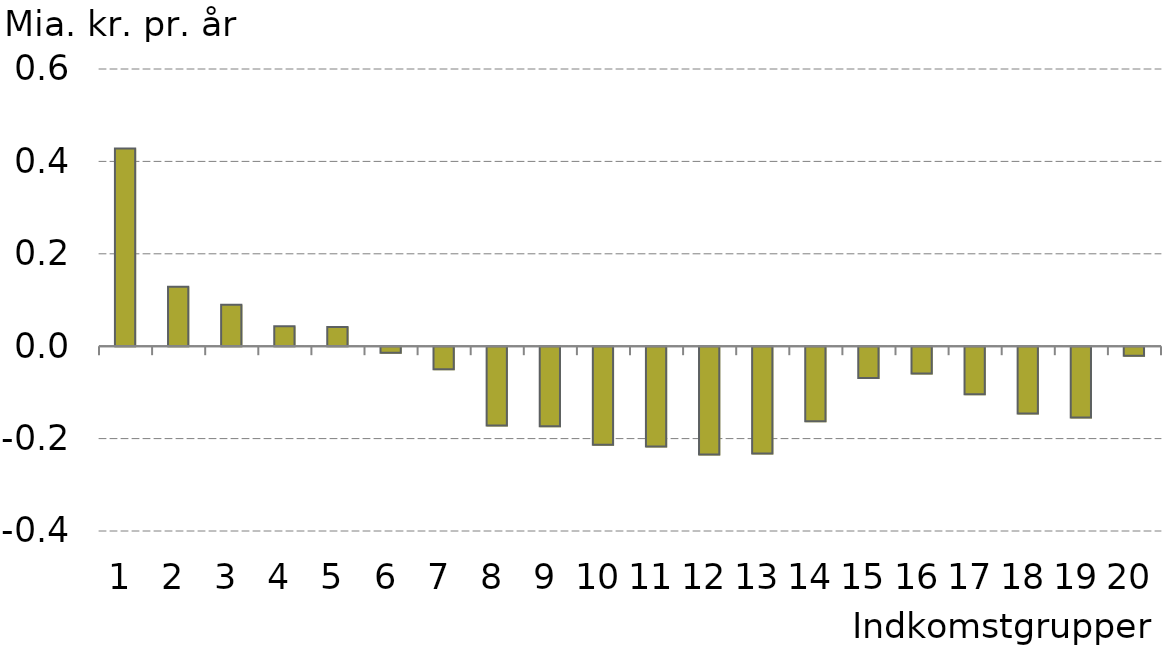
| Category |  Indkomstgrupper |
|---|---|
| 0 | 0.428 |
| 1 | 0.129 |
| 2 | 0.09 |
| 3 | 0.043 |
| 4 | 0.042 |
| 5 | -0.014 |
| 6 | -0.05 |
| 7 | -0.172 |
| 8 | -0.174 |
| 9 | -0.213 |
| 10 | -0.217 |
| 11 | -0.234 |
| 12 | -0.232 |
| 13 | -0.162 |
| 14 | -0.069 |
| 15 | -0.059 |
| 16 | -0.104 |
| 17 | -0.146 |
| 18 | -0.154 |
| 19 | -0.021 |